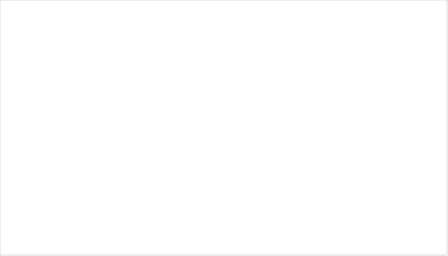
| Category | Total |
|---|---|
| Helsingør | 14 |
| Hillerød | 63 |